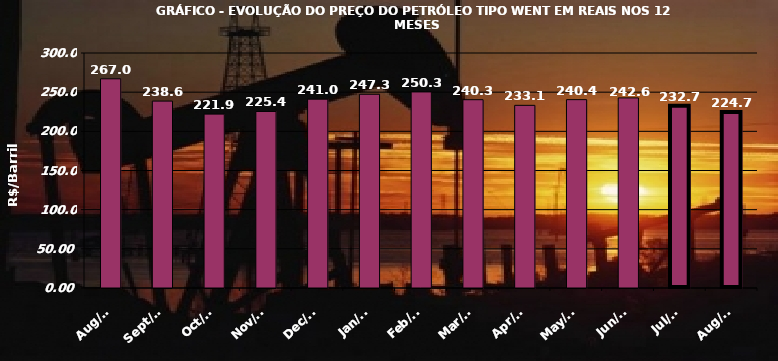
| Category | Series 1 |
|---|---|
| 2013-08-01 | 267.048 |
| 2013-09-01 | 238.604 |
| 2013-10-01 | 221.969 |
| 2013-11-01 | 225.396 |
| 2013-12-01 | 241.074 |
| 2014-01-01 | 247.328 |
| 2014-02-01 | 250.301 |
| 2014-03-01 | 240.36 |
| 2014-04-01 | 233.19 |
| 2014-05-01 | 240.456 |
| 2014-06-01 | 242.662 |
| 2014-07-01 | 232.743 |
| 2014-08-01 | 224.714 |